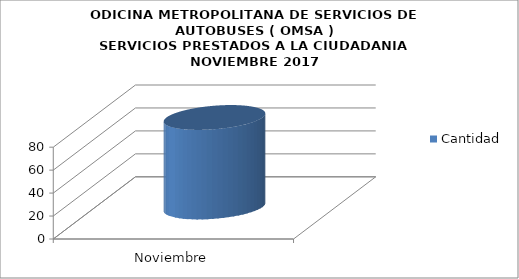
| Category | Cantidad |
|---|---|
| Noviembre | 78 |